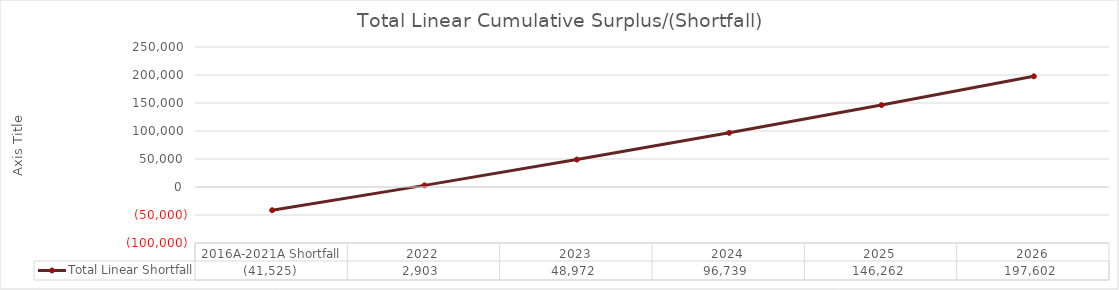
| Category | Total Linear Shortfall |
|---|---|
| 2016A-2021A Shortfall | -41524.912 |
| 2022 | 2903.479 |
| 2023 | 48972.415 |
| 2024 | 96738.884 |
| 2025 | 146261.853 |
| 2026 | 197602.341 |